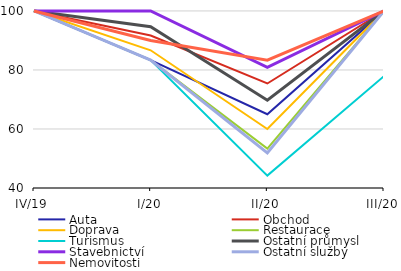
| Category | Auta | Obchod | Doprava | Restaurace | Turismus | Ostatní průmysl | Stavebnictví | Ostatní služby | Nemovitosti |
|---|---|---|---|---|---|---|---|---|---|
| IV/19 | 100 | 100 | 100 | 100 | 100 | 100 | 100 | 100 | 100 |
| I/20 | 83.333 | 91.675 | 86.667 | 83.333 | 83.333 | 94.673 | 100 | 83.333 | 90 |
| II/20 | 65 | 75.419 | 60 | 53.333 | 44.193 | 69.755 | 80.885 | 51.918 | 83.333 |
| III/20 | 100 | 100 | 100 | 100 | 77.899 | 100 | 100 | 100 | 100 |